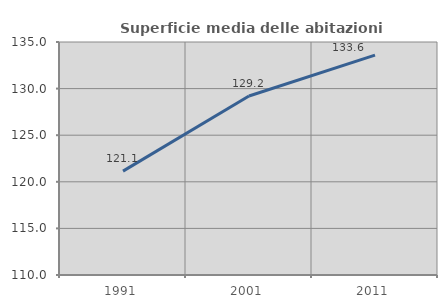
| Category | Superficie media delle abitazioni occupate |
|---|---|
| 1991.0 | 121.143 |
| 2001.0 | 129.203 |
| 2011.0 | 133.599 |